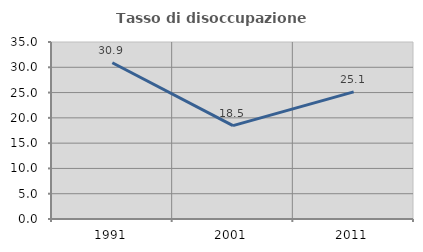
| Category | Tasso di disoccupazione giovanile  |
|---|---|
| 1991.0 | 30.904 |
| 2001.0 | 18.462 |
| 2011.0 | 25.134 |